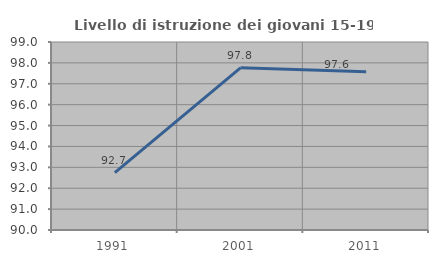
| Category | Livello di istruzione dei giovani 15-19 anni |
|---|---|
| 1991.0 | 92.746 |
| 2001.0 | 97.765 |
| 2011.0 | 97.576 |